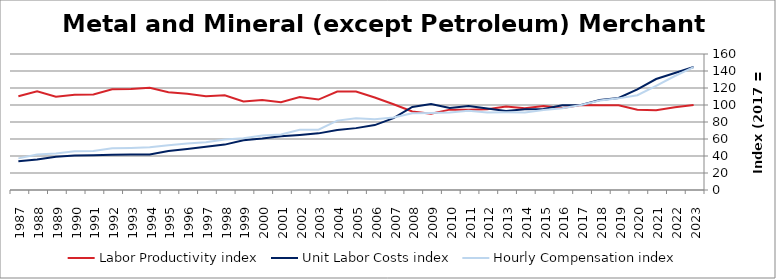
| Category | Labor Productivity index | Unit Labor Costs index | Hourly Compensation index |
|---|---|---|---|
| 2023.0 | 99.983 | 144.623 | 144.598 |
| 2022.0 | 97.436 | 137.625 | 134.097 |
| 2021.0 | 93.826 | 130.58 | 122.518 |
| 2020.0 | 94.304 | 118.284 | 111.547 |
| 2019.0 | 99.618 | 108.219 | 107.805 |
| 2018.0 | 99.606 | 105.773 | 105.356 |
| 2017.0 | 100 | 100 | 100 |
| 2016.0 | 96.443 | 99.718 | 96.171 |
| 2015.0 | 98.873 | 95.245 | 94.172 |
| 2014.0 | 96.081 | 95.045 | 91.319 |
| 2013.0 | 98.303 | 93.04 | 91.462 |
| 2012.0 | 95.077 | 95.976 | 91.251 |
| 2011.0 | 94.369 | 98.826 | 93.261 |
| 2010.0 | 94.539 | 96.54 | 91.268 |
| 2009.0 | 89.651 | 101.165 | 90.695 |
| 2008.0 | 92.336 | 97.759 | 90.267 |
| 2007.0 | 100.9 | 84.55 | 85.311 |
| 2006.0 | 108.875 | 76.352 | 83.128 |
| 2005.0 | 115.85 | 72.792 | 84.33 |
| 2004.0 | 115.859 | 70.464 | 81.639 |
| 2003.0 | 106.396 | 66.623 | 70.884 |
| 2002.0 | 109.262 | 64.767 | 70.766 |
| 2001.0 | 103.313 | 63.271 | 65.367 |
| 2000.0 | 105.796 | 60.543 | 64.052 |
| 1999.0 | 104.252 | 58.5 | 60.987 |
| 1998.0 | 111.462 | 53.404 | 59.526 |
| 1997.0 | 110.415 | 50.94 | 56.245 |
| 1996.0 | 113.187 | 48.21 | 54.568 |
| 1995.0 | 115.133 | 45.841 | 52.778 |
| 1994.0 | 120.284 | 41.711 | 50.172 |
| 1993.0 | 118.829 | 41.634 | 49.474 |
| 1992.0 | 118.575 | 41.426 | 49.121 |
| 1991.0 | 112.316 | 40.839 | 45.869 |
| 1990.0 | 112.062 | 40.578 | 45.472 |
| 1989.0 | 109.642 | 39.136 | 42.91 |
| 1988.0 | 116.03 | 35.886 | 41.639 |
| 1987.0 | 110.348 | 33.706 | 37.194 |